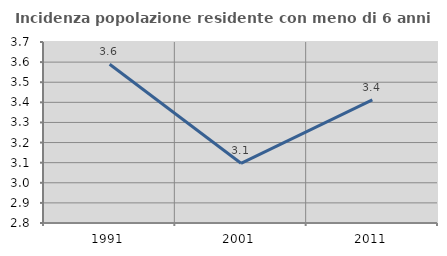
| Category | Incidenza popolazione residente con meno di 6 anni |
|---|---|
| 1991.0 | 3.589 |
| 2001.0 | 3.097 |
| 2011.0 | 3.412 |